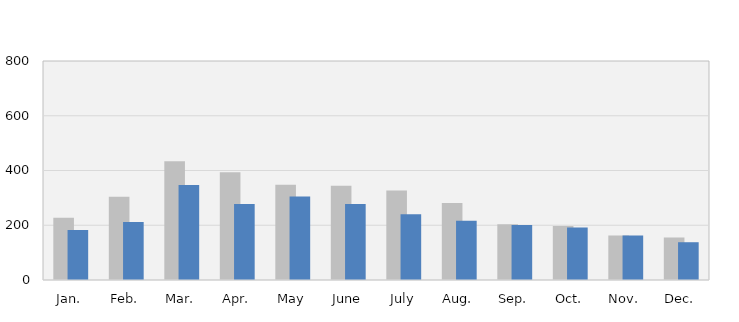
| Category | 2021 | 2022 |
|---|---|---|
| Jan. | 227 | 183 |
| Feb. | 304 | 212 |
| Mar. | 434 | 347 |
| Apr. | 394 | 278 |
| May | 348 | 305 |
| June | 344 | 278 |
| July | 327 | 240 |
| Aug. | 281 | 216 |
| Sep. | 204 | 201 |
| Oct. | 197 | 192 |
| Nov. | 163 | 163 |
| Dec. | 155 | 138 |